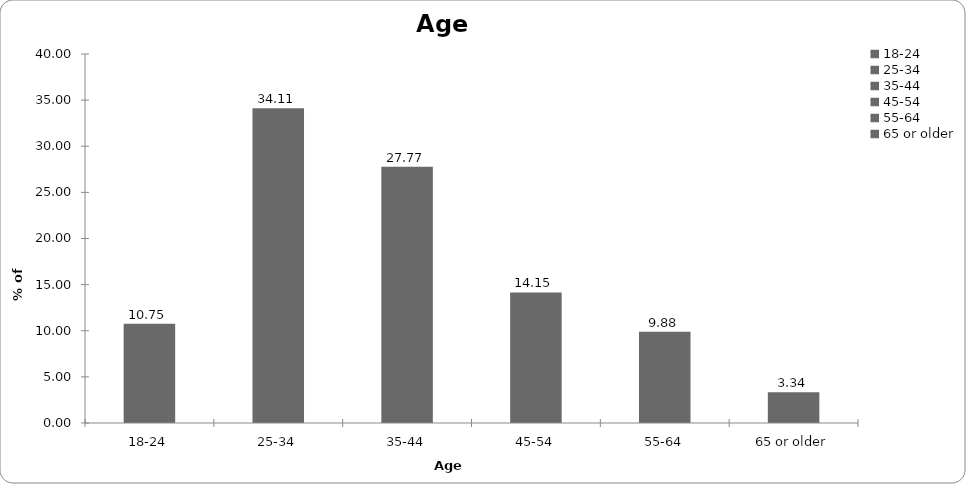
| Category | Age range |
|---|---|
| 18-24 | 10.748 |
| 25-34 | 34.112 |
| 35-44 | 27.77 |
| 45-54 | 14.152 |
| 55-64 | 9.88 |
| 65 or older | 3.338 |